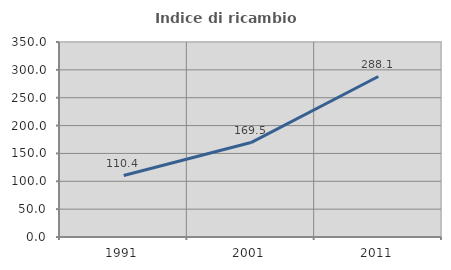
| Category | Indice di ricambio occupazionale  |
|---|---|
| 1991.0 | 110.355 |
| 2001.0 | 169.512 |
| 2011.0 | 288.06 |